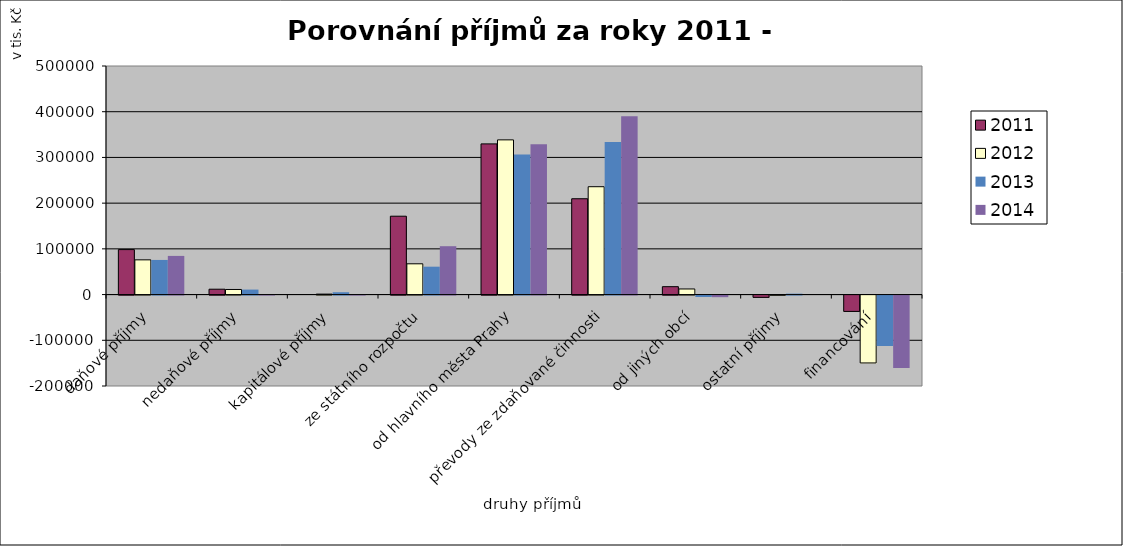
| Category | 2011 | 2012 | 2013 | 2014 |
|---|---|---|---|---|
| daňové příjmy | 98372 | 75958.2 | 75770 | 84567.1 |
| nedaňové příjmy | 11715.6 | 11135.7 | 10930 | 413.5 |
| kapitálové příjmy | 0 | 1000 | 5156.1 | 350 |
| ze státního rozpočtu | 171405 | 67292 | 61009.4 | 105803.2 |
| od hlavního města Prahy | 329646.9 | 338399.6 | 306214.4 | 328860.1 |
| převody ze zdaňované činnosti | 209631.7 | 235934.5 | 333599.6 | 390018.4 |
| od jiných obcí | 17254.3 | 12250 | -3072.5 | -3510.4 |
| ostatní příjmy | -5000 | -538.4 | 2003.1 | 0 |
| financování | -35748.8 | -148475 | -110266 | -158651.1 |